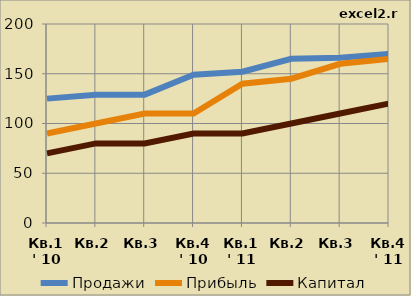
| Category | Продажи | Прибыль | Капитал |
|---|---|---|---|
| Кв.1
' 10 | 125 | 90 | 70 |
| Кв.2 | 129 | 100 | 80 |
| Кв.3 | 129 | 110 | 80 |
| Кв.4
' 10 | 149 | 110 | 90 |
| Кв.1
' 11 | 152 | 140 | 90 |
| Кв.2 | 165 | 145 | 100 |
| Кв.3 | 166 | 160 | 110 |
| Кв.4
' 11 | 170 | 165 | 120 |